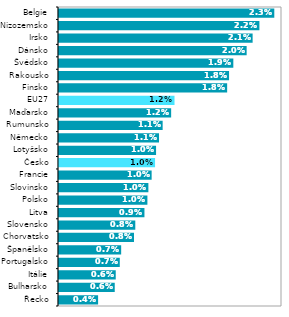
| Category | Series 0 |
|---|---|
| Řecko | 0.004 |
| Bulharsko | 0.006 |
| Itálie | 0.006 |
| Portugalsko | 0.007 |
| Španělsko | 0.007 |
| Chorvatsko | 0.008 |
| Slovensko | 0.008 |
| Litva | 0.009 |
| Polsko | 0.01 |
| Slovinsko | 0.01 |
| Francie | 0.01 |
| Česko | 0.01 |
| Lotyšsko | 0.01 |
| Německo | 0.011 |
| Rumunsko | 0.011 |
| Maďarsko | 0.012 |
| EU27 | 0.012 |
| Finsko | 0.018 |
| Rakousko | 0.018 |
| Švédsko | 0.019 |
| Dánsko | 0.02 |
| Irsko | 0.021 |
| Nizozemsko | 0.022 |
| Belgie | 0.023 |